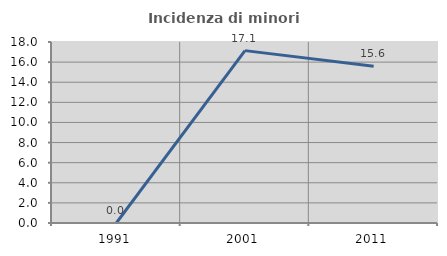
| Category | Incidenza di minori stranieri |
|---|---|
| 1991.0 | 0 |
| 2001.0 | 17.143 |
| 2011.0 | 15.584 |